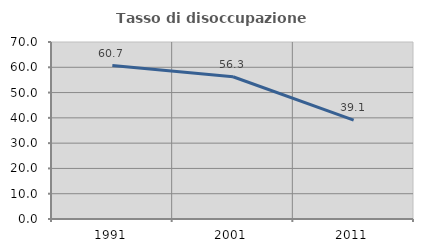
| Category | Tasso di disoccupazione giovanile  |
|---|---|
| 1991.0 | 60.662 |
| 2001.0 | 56.25 |
| 2011.0 | 39.13 |